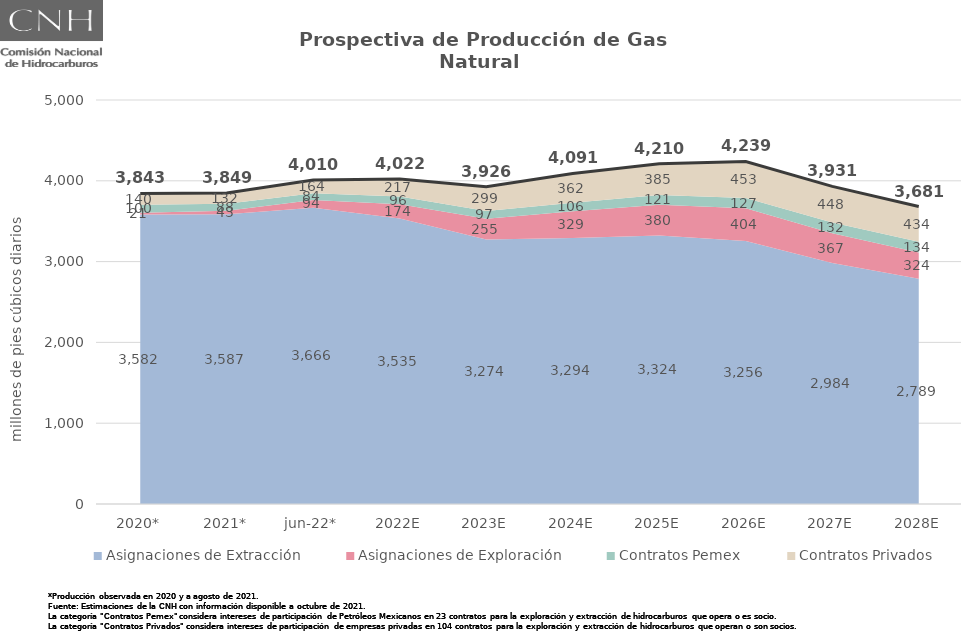
| Category | Total |
|---|---|
| 2020* | 3843.295 |
| 2021* | 3849.2 |
| jun-22* | 4009.858 |
| 2022E | 4021.769 |
| 2023E | 3925.953 |
| 2024E | 4091.168 |
| 2025E | 4210.236 |
| 2026E | 4239.197 |
| 2027E | 3931.086 |
| 2028E | 3681.179 |